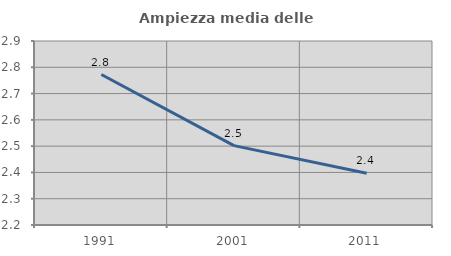
| Category | Ampiezza media delle famiglie |
|---|---|
| 1991.0 | 2.772 |
| 2001.0 | 2.502 |
| 2011.0 | 2.397 |